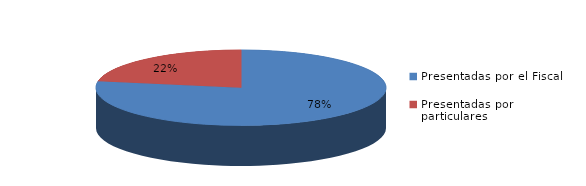
| Category | Series 0 |
|---|---|
| Presentadas por el Fiscal | 436 |
| Presentadas por particulares | 125 |